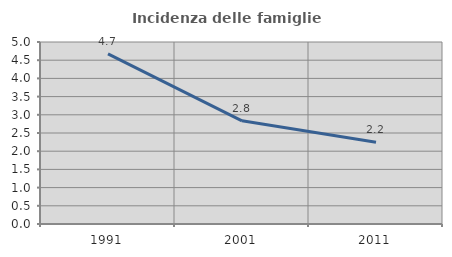
| Category | Incidenza delle famiglie numerose |
|---|---|
| 1991.0 | 4.675 |
| 2001.0 | 2.834 |
| 2011.0 | 2.244 |